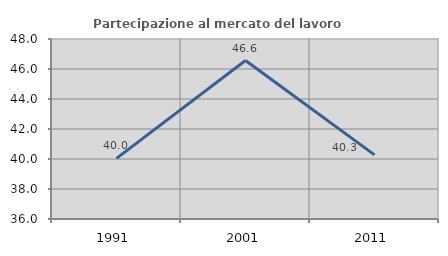
| Category | Partecipazione al mercato del lavoro  femminile |
|---|---|
| 1991.0 | 40.038 |
| 2001.0 | 46.565 |
| 2011.0 | 40.272 |